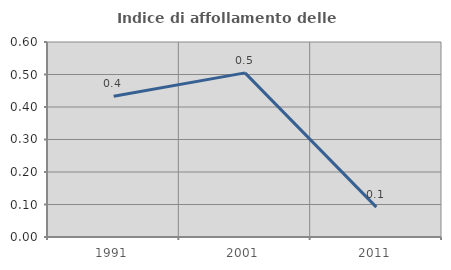
| Category | Indice di affollamento delle abitazioni  |
|---|---|
| 1991.0 | 0.433 |
| 2001.0 | 0.505 |
| 2011.0 | 0.092 |